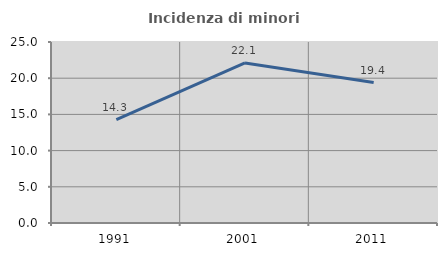
| Category | Incidenza di minori stranieri |
|---|---|
| 1991.0 | 14.286 |
| 2001.0 | 22.105 |
| 2011.0 | 19.403 |